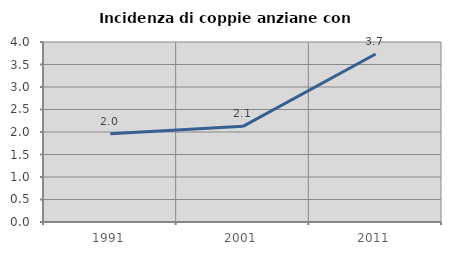
| Category | Incidenza di coppie anziane con figli |
|---|---|
| 1991.0 | 1.961 |
| 2001.0 | 2.126 |
| 2011.0 | 3.733 |